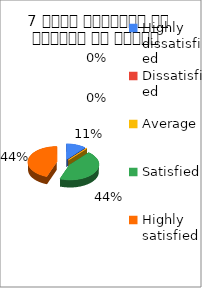
| Category | 7 विषय अवधारणा पर शिक्षक का ज्ञान  |
|---|---|
| Highly dissatisfied | 1 |
| Dissatisfied | 0 |
| Average | 0 |
| Satisfied | 4 |
| Highly satisfied | 4 |